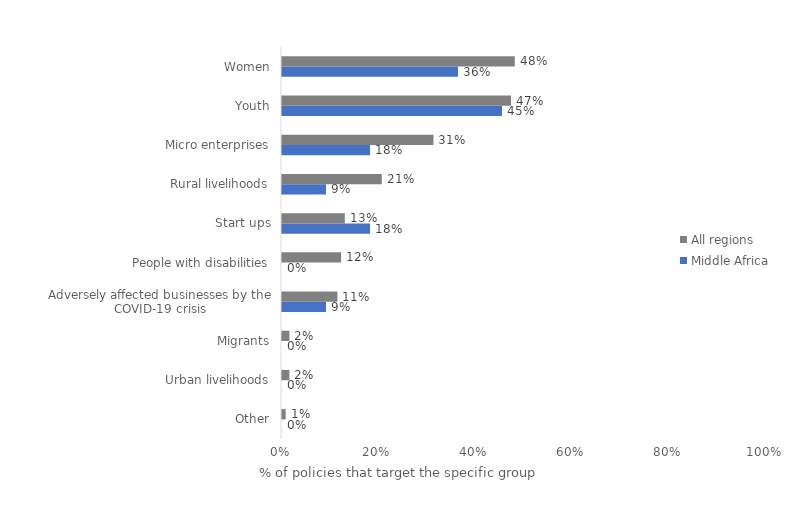
| Category | Middle Africa | All regions |
|---|---|---|
| Other | 0 | 0.008 |
| Urban livelihoods | 0 | 0.015 |
| Migrants | 0 | 0.015 |
| Adversely affected businesses by the COVID-19 crisis | 0.091 | 0.115 |
| People with disabilities | 0 | 0.122 |
| Start ups | 0.182 | 0.13 |
| Rural livelihoods | 0.091 | 0.206 |
| Micro enterprises | 0.182 | 0.313 |
| Youth | 0.455 | 0.473 |
| Women | 0.364 | 0.481 |